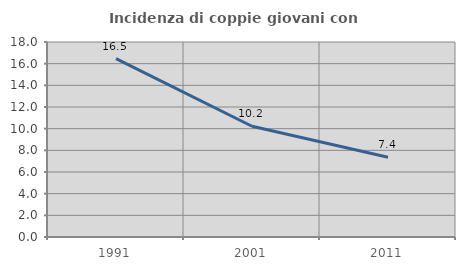
| Category | Incidenza di coppie giovani con figli |
|---|---|
| 1991.0 | 16.467 |
| 2001.0 | 10.223 |
| 2011.0 | 7.358 |